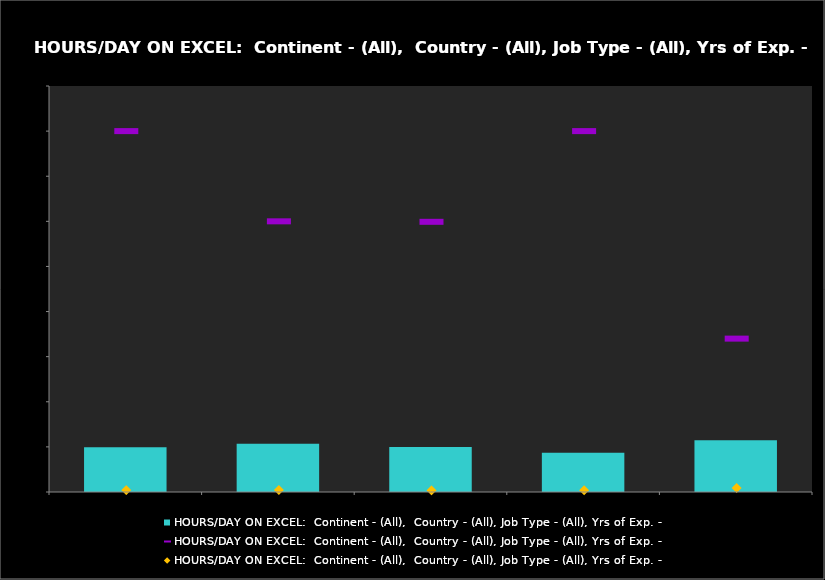
| Category | Average of Salary in USD |
|---|---|
| 1 or 2 hours a day | 49726.376 |
| 2 to 3 hours per day | 53554.662 |
| 4 to 6 hours a day | 49995.79 |
| All the 8 hours baby, all the 8! | 43571.163 |
| Excel ?!? What Excel? | 57493.382 |